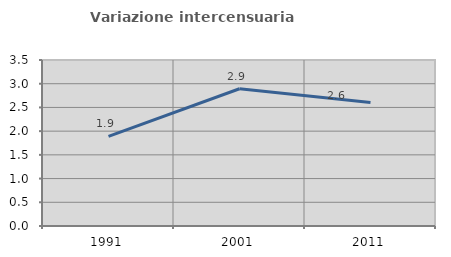
| Category | Variazione intercensuaria annua |
|---|---|
| 1991.0 | 1.89 |
| 2001.0 | 2.894 |
| 2011.0 | 2.606 |